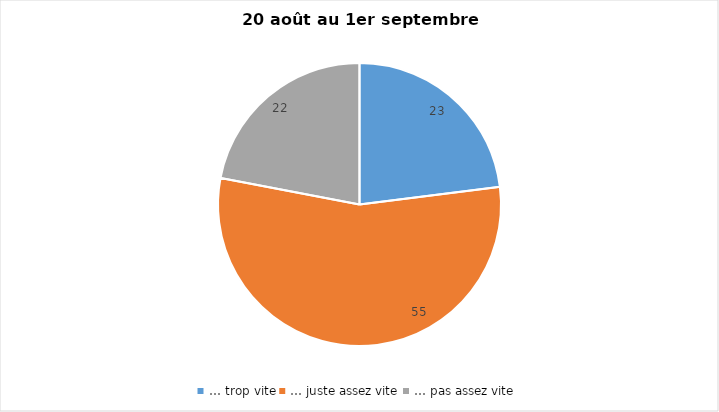
| Category | Series 0 |
|---|---|
| … trop vite | 23 |
| … juste assez vite | 55 |
| … pas assez vite | 22 |